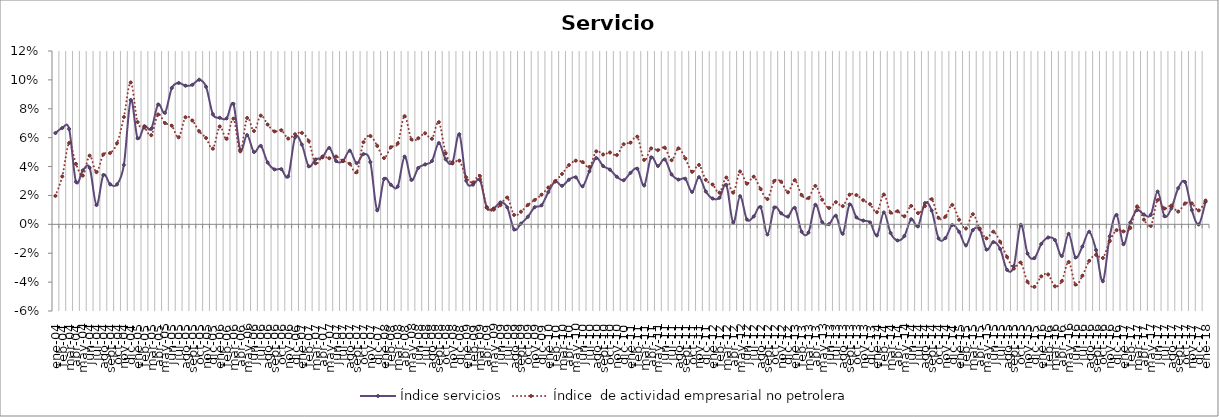
| Category | Índice servicios | Índice  de actividad empresarial no petrolera |
|---|---|---|
| 2004-01-01 | 0.063 | 0.02 |
| 2004-02-01 | 0.067 | 0.033 |
| 2004-03-01 | 0.066 | 0.056 |
| 2004-04-01 | 0.029 | 0.042 |
| 2004-05-01 | 0.037 | 0.034 |
| 2004-06-01 | 0.039 | 0.048 |
| 2004-07-01 | 0.013 | 0.036 |
| 2004-08-01 | 0.034 | 0.048 |
| 2004-09-01 | 0.028 | 0.049 |
| 2004-10-01 | 0.028 | 0.056 |
| 2004-11-01 | 0.041 | 0.074 |
| 2004-12-01 | 0.086 | 0.098 |
| 2005-01-01 | 0.06 | 0.071 |
| 2005-02-01 | 0.068 | 0.067 |
| 2005-03-01 | 0.066 | 0.062 |
| 2005-04-01 | 0.083 | 0.076 |
| 2005-05-01 | 0.077 | 0.07 |
| 2005-06-01 | 0.094 | 0.068 |
| 2005-07-01 | 0.098 | 0.06 |
| 2005-08-01 | 0.096 | 0.074 |
| 2005-09-01 | 0.097 | 0.072 |
| 2005-10-01 | 0.1 | 0.064 |
| 2005-11-01 | 0.095 | 0.06 |
| 2005-12-01 | 0.076 | 0.052 |
| 2006-01-01 | 0.074 | 0.068 |
| 2006-02-01 | 0.073 | 0.059 |
| 2006-03-01 | 0.083 | 0.073 |
| 2006-04-01 | 0.052 | 0.051 |
| 2006-05-01 | 0.062 | 0.074 |
| 2006-06-01 | 0.05 | 0.065 |
| 2006-07-01 | 0.054 | 0.075 |
| 2006-08-01 | 0.043 | 0.069 |
| 2006-09-01 | 0.038 | 0.064 |
| 2006-10-01 | 0.038 | 0.065 |
| 2006-11-01 | 0.033 | 0.059 |
| 2006-12-01 | 0.06 | 0.062 |
| 2007-01-01 | 0.055 | 0.063 |
| 2007-02-01 | 0.04 | 0.058 |
| 2007-03-01 | 0.045 | 0.042 |
| 2007-04-01 | 0.046 | 0.047 |
| 2007-05-01 | 0.053 | 0.046 |
| 2007-06-01 | 0.044 | 0.047 |
| 2007-07-01 | 0.044 | 0.044 |
| 2007-08-01 | 0.051 | 0.042 |
| 2007-09-01 | 0.042 | 0.036 |
| 2007-10-01 | 0.049 | 0.057 |
| 2007-11-01 | 0.043 | 0.061 |
| 2007-12-01 | 0.01 | 0.054 |
| 2008-01-01 | 0.031 | 0.046 |
| 2008-02-01 | 0.027 | 0.053 |
| 2008-03-01 | 0.026 | 0.056 |
| 2008-04-01 | 0.047 | 0.075 |
| 2008-05-01 | 0.031 | 0.059 |
| 2008-06-01 | 0.039 | 0.06 |
| 2008-07-01 | 0.041 | 0.063 |
| 2008-08-01 | 0.044 | 0.059 |
| 2008-09-01 | 0.056 | 0.071 |
| 2008-10-01 | 0.045 | 0.049 |
| 2008-11-01 | 0.043 | 0.042 |
| 2008-12-01 | 0.062 | 0.044 |
| 2009-01-01 | 0.03 | 0.033 |
| 2009-02-01 | 0.027 | 0.029 |
| 2009-03-01 | 0.031 | 0.033 |
| 2009-04-01 | 0.012 | 0.012 |
| 2009-05-01 | 0.011 | 0.01 |
| 2009-06-01 | 0.015 | 0.013 |
| 2009-07-01 | 0.012 | 0.019 |
| 2009-08-01 | -0.004 | 0.006 |
| 2009-09-01 | 0 | 0.009 |
| 2009-10-01 | 0.005 | 0.013 |
| 2009-11-01 | 0.012 | 0.017 |
| 2009-12-01 | 0.013 | 0.02 |
| 2010-01-01 | 0.022 | 0.026 |
| 2010-02-01 | 0.03 | 0.03 |
| 2010-03-01 | 0.027 | 0.035 |
| 2010-04-01 | 0.031 | 0.041 |
| 2010-05-01 | 0.033 | 0.044 |
| 2010-06-01 | 0.026 | 0.043 |
| 2010-07-01 | 0.037 | 0.04 |
| 2010-08-01 | 0.046 | 0.051 |
| 2010-09-01 | 0.04 | 0.048 |
| 2010-10-01 | 0.038 | 0.05 |
| 2010-11-01 | 0.033 | 0.048 |
| 2010-12-01 | 0.031 | 0.055 |
| 2011-01-01 | 0.036 | 0.057 |
| 2011-02-01 | 0.039 | 0.061 |
| 2011-03-01 | 0.027 | 0.045 |
| 2011-04-01 | 0.046 | 0.053 |
| 2011-05-01 | 0.04 | 0.051 |
| 2011-06-01 | 0.045 | 0.053 |
| 2011-07-01 | 0.035 | 0.044 |
| 2011-08-01 | 0.031 | 0.053 |
| 2011-09-01 | 0.032 | 0.046 |
| 2011-10-01 | 0.022 | 0.036 |
| 2011-11-01 | 0.033 | 0.041 |
| 2011-12-01 | 0.023 | 0.031 |
| 2012-01-01 | 0.018 | 0.028 |
| 2012-02-01 | 0.018 | 0.022 |
| 2012-03-01 | 0.027 | 0.032 |
| 2012-04-01 | 0.001 | 0.022 |
| 2012-05-01 | 0.02 | 0.037 |
| 2012-06-01 | 0.003 | 0.028 |
| 2012-07-01 | 0.005 | 0.033 |
| 2012-08-01 | 0.012 | 0.024 |
| 2012-09-01 | -0.007 | 0.018 |
| 2012-10-01 | 0.012 | 0.03 |
| 2012-11-01 | 0.008 | 0.03 |
| 2012-12-01 | 0.005 | 0.022 |
| 2013-01-01 | 0.011 | 0.031 |
| 2013-02-01 | -0.005 | 0.02 |
| 2013-03-01 | -0.006 | 0.018 |
| 2013-04-01 | 0.014 | 0.027 |
| 2013-05-01 | 0.002 | 0.017 |
| 2013-06-01 | 0 | 0.011 |
| 2013-07-01 | 0.006 | 0.015 |
| 2013-08-01 | -0.007 | 0.013 |
| 2013-09-01 | 0.014 | 0.021 |
| 2013-10-01 | 0.005 | 0.02 |
| 2013-11-01 | 0.003 | 0.017 |
| 2013-12-01 | 0.001 | 0.014 |
| 2014-01-01 | -0.008 | 0.008 |
| 2014-02-01 | 0.008 | 0.021 |
| 2014-03-01 | -0.006 | 0.008 |
| 2014-04-01 | -0.011 | 0.009 |
| 2014-05-01 | -0.008 | 0.006 |
| 2014-06-01 | 0.003 | 0.013 |
| 2014-07-01 | -0.001 | 0.008 |
| 2014-08-01 | 0.015 | 0.013 |
| 2014-09-01 | 0.01 | 0.017 |
| 2014-10-01 | -0.01 | 0.004 |
| 2014-11-01 | -0.01 | 0.005 |
| 2014-12-01 | 0 | 0.013 |
| 2015-01-01 | -0.005 | 0.003 |
| 2015-02-01 | -0.015 | -0.003 |
| 2015-03-01 | -0.004 | 0.007 |
| 2015-04-01 | -0.003 | -0.003 |
| 2015-05-01 | -0.018 | -0.01 |
| 2015-06-01 | -0.012 | -0.005 |
| 2015-07-01 | -0.017 | -0.012 |
| 2015-08-01 | -0.032 | -0.023 |
| 2015-09-01 | -0.029 | -0.031 |
| 2015-10-01 | 0 | -0.026 |
| 2015-11-01 | -0.02 | -0.04 |
| 2015-12-01 | -0.023 | -0.043 |
| 2016-01-01 | -0.014 | -0.036 |
| 2016-02-01 | -0.009 | -0.035 |
| 2016-03-01 | -0.011 | -0.043 |
| 2016-04-01 | -0.022 | -0.039 |
| 2016-05-01 | -0.007 | -0.026 |
| 2016-06-01 | -0.023 | -0.042 |
| 2016-07-01 | -0.015 | -0.036 |
| 2016-08-01 | -0.005 | -0.025 |
| 2016-09-01 | -0.018 | -0.021 |
| 2016-10-01 | -0.039 | -0.023 |
| 2016-11-01 | -0.008 | -0.012 |
| 2016-12-01 | 0.007 | -0.004 |
| 2017-01-01 | -0.014 | -0.005 |
| 2017-02-01 | 0.001 | -0.003 |
| 2017-03-01 | 0.01 | 0.012 |
| 2017-04-01 | 0.007 | 0.003 |
| 2017-05-01 | 0.007 | -0.001 |
| 2017-06-01 | 0.023 | 0.017 |
| 2017-07-01 | 0.006 | 0.011 |
| 2017-08-01 | 0.011 | 0.013 |
| 2017-09-01 | 0.025 | 0.009 |
| 2017-10-01 | 0.029 | 0.014 |
| 2017-11-01 | 0.01 | 0.014 |
| 2017-12-01 | 0 | 0.01 |
| 2018-01-01 | 0.016 | 0.016 |